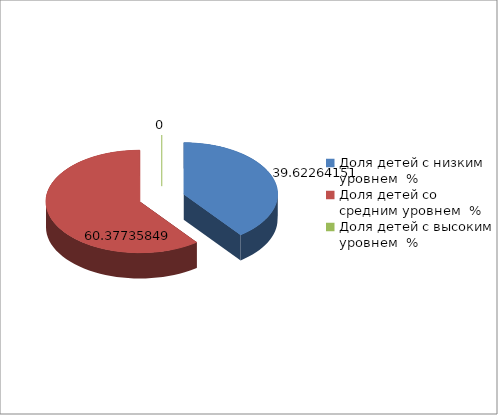
| Category | Series 0 |
|---|---|
| Доля детей с низким уровнем  % | 39.623 |
| Доля детей со средним уровнем  % | 60.377 |
| Доля детей с высоким уровнем  % | 0 |